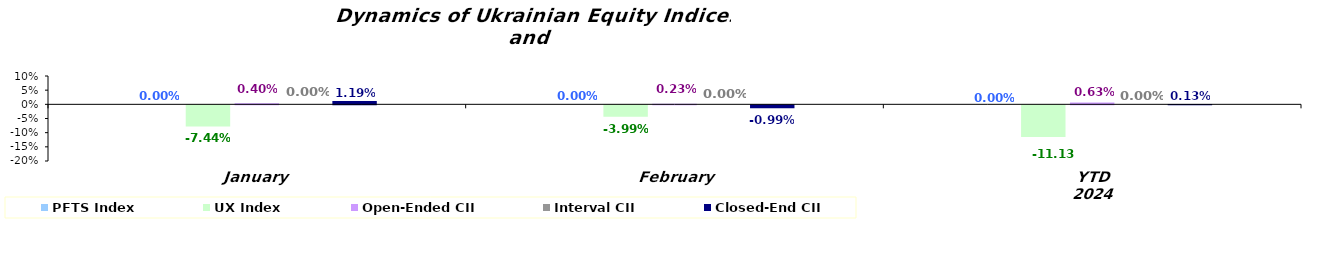
| Category | PFTS Index | UX Index | Open-Ended CII | Interval CII | Closed-End CII |
|---|---|---|---|---|---|
| January | 0 | -0.074 | 0.004 | 0 | 0.012 |
| February | 0 | -0.04 | 0.002 | 0 | -0.01 |
| YTD 2024 | 0 | -0.111 | 0.006 | 0 | 0.001 |